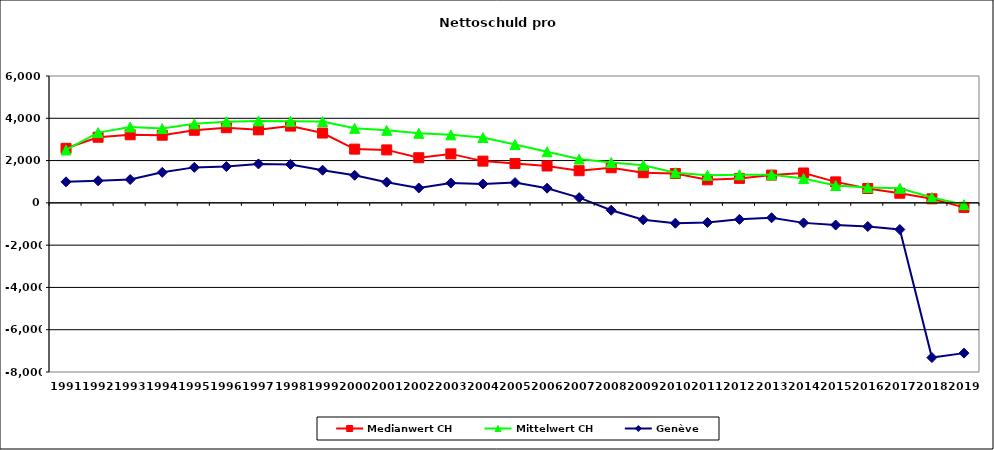
| Category | Medianwert CH | Mittelwert CH | Genève |
|---|---|---|---|
| 1991.0 | 2580 | 2501.231 | 995 |
| 1992.0 | 3103.5 | 3322.389 | 1045 |
| 1993.0 | 3220 | 3589 | 1102 |
| 1994.0 | 3199 | 3514.619 | 1443 |
| 1995.0 | 3433 | 3736.5 | 1678 |
| 1996.0 | 3553 | 3837.333 | 1716 |
| 1997.0 | 3453.5 | 3876.545 | 1841 |
| 1998.0 | 3630 | 3856.13 | 1819 |
| 1999.0 | 3302 | 3847.739 | 1544 |
| 2000.0 | 2542 | 3524.64 | 1305 |
| 2001.0 | 2505 | 3428.8 | 977 |
| 2002.0 | 2134 | 3290.4 | 703 |
| 2003.0 | 2316 | 3215.6 | 937 |
| 2004.0 | 1974 | 3090.325 | 895 |
| 2005.0 | 1858 | 2756.351 | 958 |
| 2006.0 | 1744.5 | 2416.426 | 694 |
| 2007.0 | 1520 | 2070.521 | 247 |
| 2008.0 | 1660 | 1907.634 | -351 |
| 2009.0 | 1426 | 1780.53 | -801.9 |
| 2010.0 | 1388.8 | 1427.327 | -963.2 |
| 2011.0 | 1091 | 1302.405 | -925.9 |
| 2012.0 | 1157.645 | 1326.071 | -780.6 |
| 2013.0 | 1313 | 1328.597 | -705.74 |
| 2014.0 | 1412.435 | 1147.291 | -947 |
| 2015.0 | 992 | 819.292 | -1049 |
| 2016.0 | 679 | 729.357 | -1118 |
| 2017.0 | 456.291 | 689.633 | -1260 |
| 2018.0 | 191 | 252.883 | -7317.9 |
| 2019.0 | -215 | -84.065 | -7107 |